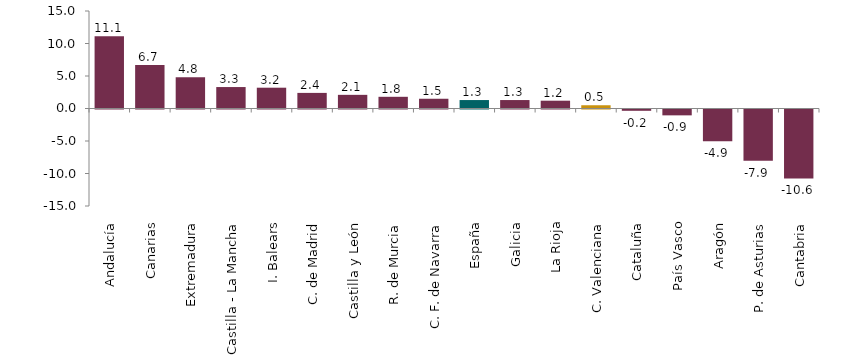
| Category | oct-2023 |
|---|---|
| Andalucía | 11.1 |
| Canarias | 6.7 |
| Extremadura | 4.8 |
| Castilla - La Mancha | 3.3 |
| I. Balears | 3.2 |
| C. de Madrid | 2.4 |
| Castilla y León | 2.1 |
| R. de Murcia | 1.8 |
| C. F. de Navarra | 1.5 |
| España | 1.3 |
| Galicia | 1.3 |
| La Rioja | 1.2 |
| C. Valenciana | 0.5 |
| Cataluña | -0.2 |
| País Vasco | -0.9 |
| Aragón | -4.9 |
| P. de Asturias | -7.9 |
| Cantabria | -10.6 |